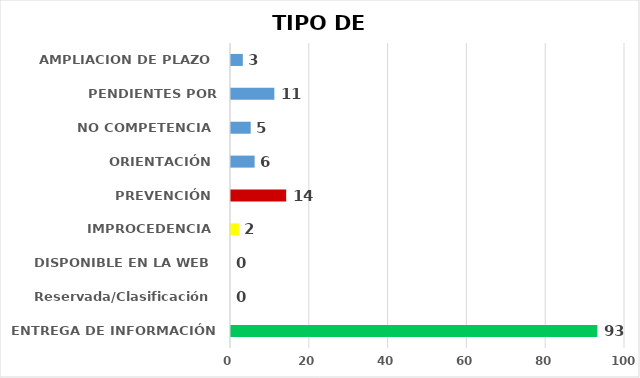
| Category | CANTIDAD DE RESPUESTAS |
|---|---|
| ENTREGA DE INFORMACIÓN | 93 |
| Reservada/Clasificación | 0 |
| DISPONIBLE EN LA WEB | 0 |
| IMPROCEDENCIA | 2 |
| PREVENCIÓN | 14 |
| ORIENTACIÓN | 6 |
| NO COMPETENCIA | 5 |
| PENDIENTES POR CONTESTAR | 11 |
| AMPLIACION DE PLAZO | 3 |